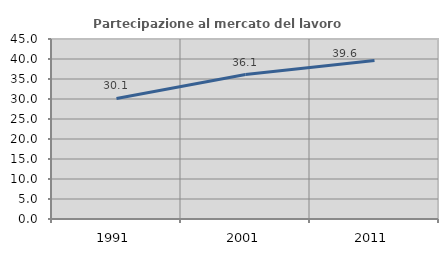
| Category | Partecipazione al mercato del lavoro  femminile |
|---|---|
| 1991.0 | 30.148 |
| 2001.0 | 36.12 |
| 2011.0 | 39.597 |